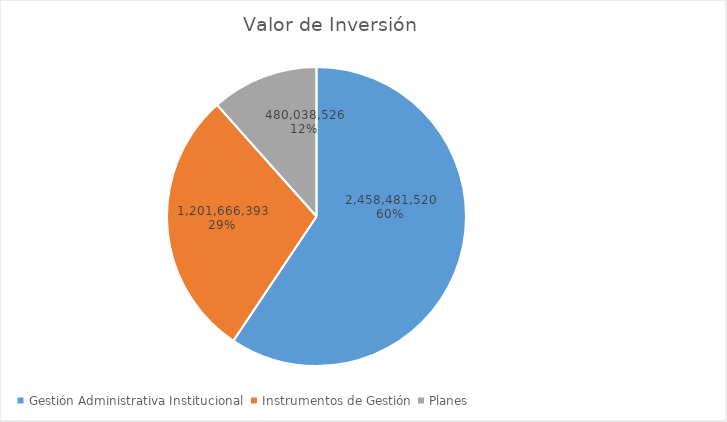
| Category | Valor de Inversión | Porcentaje de Ejecución dentro de la Actividad |
|---|---|---|
| Gestión Administrativa Institucional | 2458481520 | 8 |
| Instrumentos de Gestión | 1201666393 | 8 |
| Planes | 480038526 | 4 |